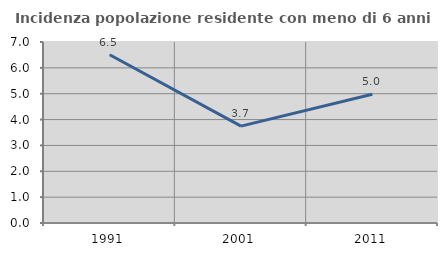
| Category | Incidenza popolazione residente con meno di 6 anni |
|---|---|
| 1991.0 | 6.507 |
| 2001.0 | 3.747 |
| 2011.0 | 4.978 |